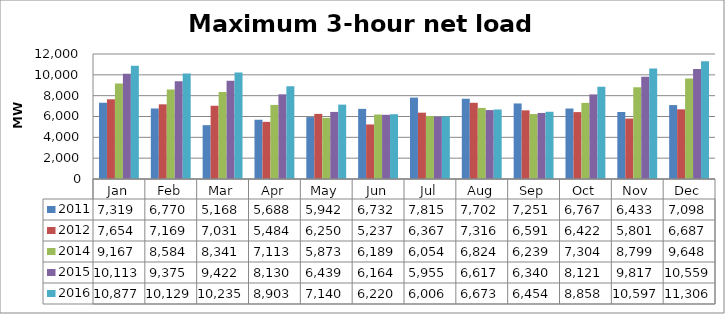
| Category | 2011 | 2012 | 2014 | 2015 | 2016 |
|---|---|---|---|---|---|
| Jan | 7318.934 | 7653.914 | 9167.046 | 10113.032 | 10877.412 |
| Feb | 6770.377 | 7169.061 | 8583.573 | 9374.793 | 10129.341 |
| Mar | 5167.636 | 7031.31 | 8340.908 | 9421.919 | 10234.864 |
| Apr | 5688.068 | 5484.206 | 7112.521 | 8130.093 | 8903.221 |
| May | 5942.315 | 6250.017 | 5873.001 | 6438.559 | 7139.842 |
| Jun | 6732.5 | 5237.479 | 6189.275 | 6163.856 | 6219.933 |
| Jul | 7814.837 | 6366.701 | 6054.187 | 5954.772 | 6006.474 |
| Aug | 7702.375 | 7315.998 | 6823.879 | 6617.255 | 6672.656 |
| Sep | 7251.255 | 6591.044 | 6239.133 | 6340.363 | 6453.56 |
| Oct | 6766.746 | 6421.837 | 7304.477 | 8120.845 | 8858.131 |
| Nov | 6432.581 | 5801.164 | 8798.521 | 9816.841 | 10597.019 |
| Dec | 7097.56 | 6687.37 | 9648.038 | 10558.632 | 11305.682 |